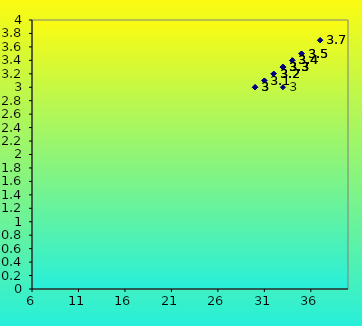
| Category | Series 0 |
|---|---|
| 33.0 | 3 |
| 34.0 | 3.4 |
| 33.0 | 3.3 |
| 33.0 | 3.3 |
| 35.0 | 3.5 |
| 34.0 | 3.4 |
| 33.0 | 3.3 |
| 32.0 | 3.2 |
| 35.0 | 3.5 |
| 32.0 | 3.2 |
| 35.0 | 3.5 |
| 31.0 | 3.1 |
| 33.0 | 3.3 |
| 32.0 | 3.2 |
| 32.0 | 3.2 |
| 37.0 | 3.7 |
| 30.0 | 3 |
| 31.0 | 3.1 |
| 33.0 | 3.3 |
| 34.0 | 3.4 |
| 37.0 | 3.7 |
| 33.0 | 3.3 |
| 30.0 | 3 |
| 30.0 | 3 |
| 34.0 | 3.4 |